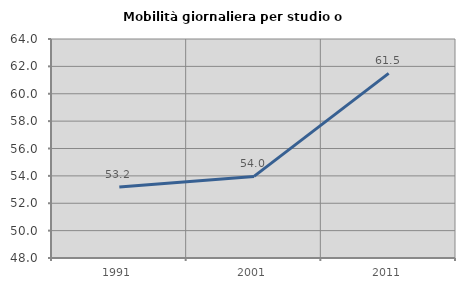
| Category | Mobilità giornaliera per studio o lavoro |
|---|---|
| 1991.0 | 53.195 |
| 2001.0 | 53.962 |
| 2011.0 | 61.492 |